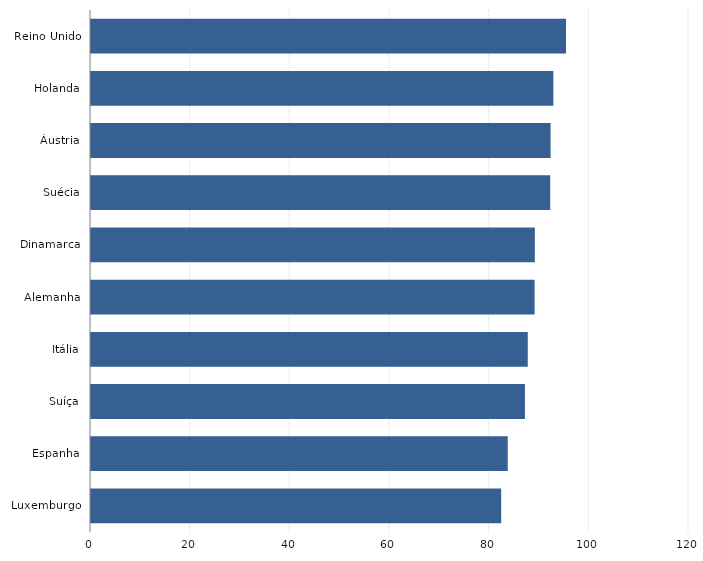
| Category | Series 0 |
|---|---|
| Luxemburgo | 82.317 |
| Espanha | 83.632 |
| Suíça | 87.075 |
| Itália | 87.646 |
| Alemanha | 89.02 |
| Dinamarca | 89.062 |
| Suécia | 92.157 |
| Áustria | 92.227 |
| Holanda | 92.777 |
| Reino Unido | 95.319 |